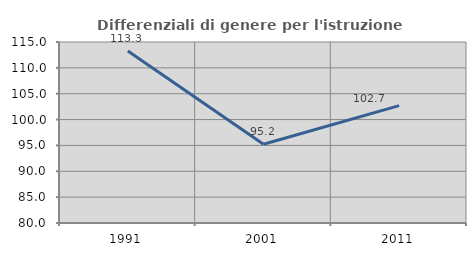
| Category | Differenziali di genere per l'istruzione superiore |
|---|---|
| 1991.0 | 113.251 |
| 2001.0 | 95.238 |
| 2011.0 | 102.687 |